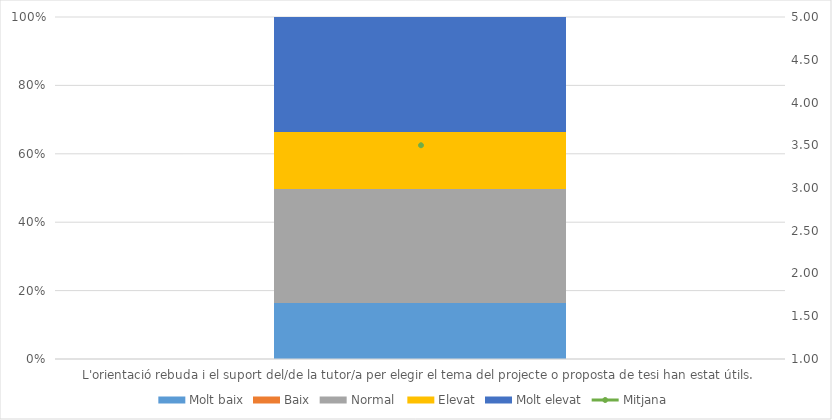
| Category | Molt baix | Baix | Normal  | Elevat | Molt elevat |
|---|---|---|---|---|---|
| L'orientació rebuda i el suport del/de la tutor/a per elegir el tema del projecte o proposta de tesi han estat útils. | 1 | 0 | 2 | 1 | 2 |